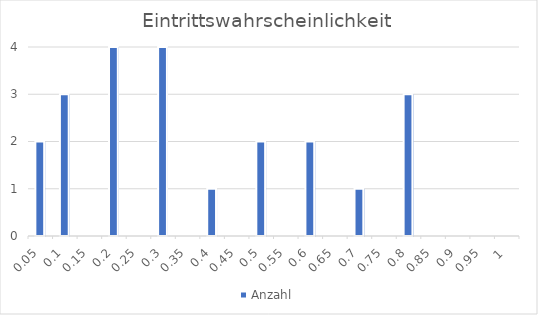
| Category | Anzahl |
|---|---|
| 0.05 | 2 |
| 0.1 | 3 |
| 0.15 | 0 |
| 0.2 | 4 |
| 0.25 | 0 |
| 0.3 | 5 |
| 0.35 | 0 |
| 0.4 | 1 |
| 0.45 | 0 |
| 0.5 | 2 |
| 0.55 | 0 |
| 0.6 | 2 |
| 0.65 | 0 |
| 0.7 | 1 |
| 0.75 | 0 |
| 0.8 | 3 |
| 0.85 | 0 |
| 0.9 | 0 |
| 0.95 | 0 |
| 1.0 | 0 |